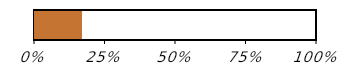
| Category | Перебіг придбання (1 із 6) |
|---|---|
| Придбано | 0.167 |